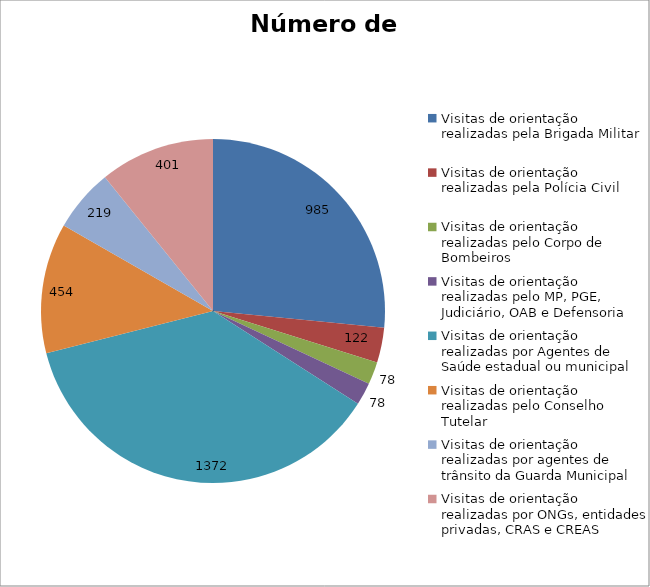
| Category | Número de Ações |
|---|---|
| Visitas de orientação realizadas pela Brigada Militar | 985 |
| Visitas de orientação realizadas pela Polícia Civil | 122 |
| Visitas de orientação realizadas pelo Corpo de Bombeiros | 78 |
| Visitas de orientação realizadas pelo MP, PGE, Judiciário, OAB e Defensoria | 78 |
| Visitas de orientação realizadas por Agentes de Saúde estadual ou municipal | 1372 |
| Visitas de orientação realizadas pelo Conselho Tutelar | 454 |
| Visitas de orientação realizadas por agentes de trânsito da Guarda Municipal | 219 |
| Visitas de orientação realizadas por ONGs, entidades privadas, CRAS e CREAS | 401 |